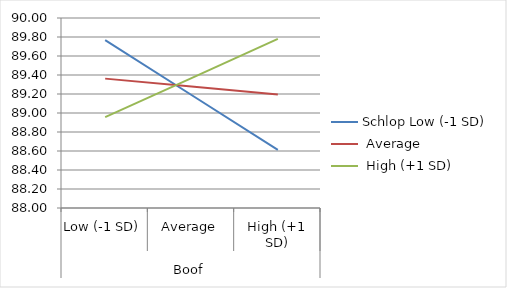
| Category | Schlop Low (-1 SD)  | Average | High (+1 SD) |
|---|---|---|---|
| 0 | 89.768 | 89.362 | 88.956 |
| 1 | 89.19 | 89.279 | 89.368 |
| 2 | 88.612 | 89.196 | 89.78 |